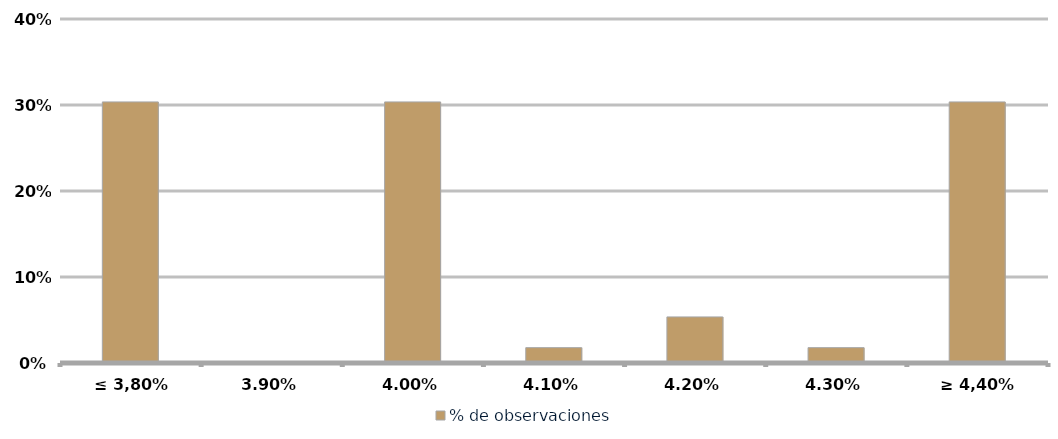
| Category | % de observaciones  |
|---|---|
| ≤ 3,80% | 0.304 |
| 3,90% | 0 |
| 4,00% | 0.304 |
| 4,10% | 0.018 |
| 4,20% | 0.054 |
| 4,30% | 0.018 |
| ≥ 4,40% | 0.304 |